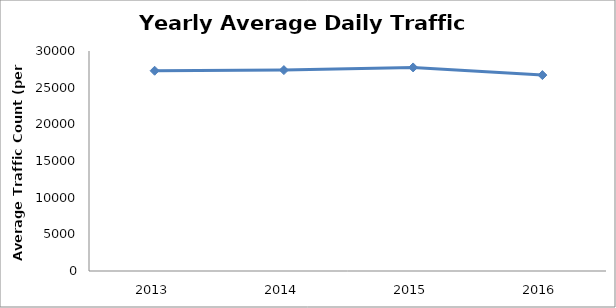
| Category | Series 0 |
|---|---|
| 2013.0 | 27307.948 |
| 2014.0 | 27395.31 |
| 2015.0 | 27760.619 |
| 2016.0 | 26713.598 |